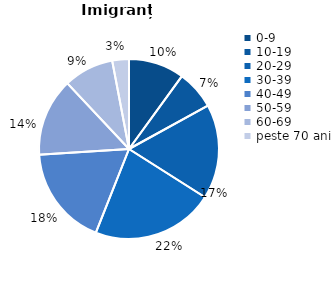
| Category | Imigranți |
|---|---|
| 0-9 | 10 |
| 10-19 | 7 |
| 20-29 | 17 |
| 30-39 | 22 |
| 40-49 | 18 |
| 50-59 | 14 |
| 60-69 | 9 |
| peste 70 ani | 3 |